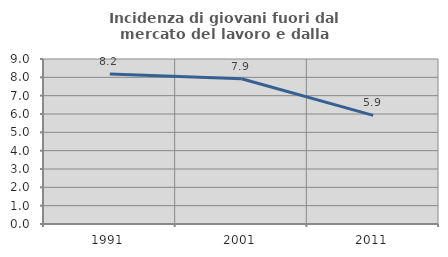
| Category | Incidenza di giovani fuori dal mercato del lavoro e dalla formazione  |
|---|---|
| 1991.0 | 8.177 |
| 2001.0 | 7.922 |
| 2011.0 | 5.927 |